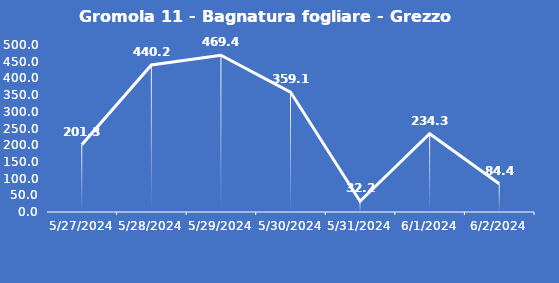
| Category | Gromola 11 - Bagnatura fogliare - Grezzo (min) |
|---|---|
| 5/27/24 | 201.3 |
| 5/28/24 | 440.2 |
| 5/29/24 | 469.4 |
| 5/30/24 | 359.1 |
| 5/31/24 | 32.2 |
| 6/1/24 | 234.3 |
| 6/2/24 | 84.4 |